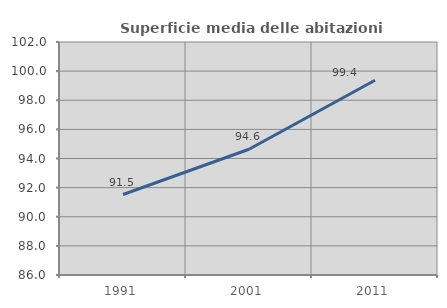
| Category | Superficie media delle abitazioni occupate |
|---|---|
| 1991.0 | 91.526 |
| 2001.0 | 94.637 |
| 2011.0 | 99.372 |